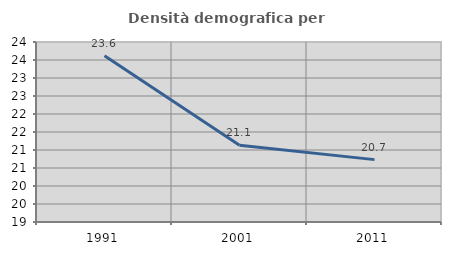
| Category | Densità demografica |
|---|---|
| 1991.0 | 23.621 |
| 2001.0 | 21.135 |
| 2011.0 | 20.733 |